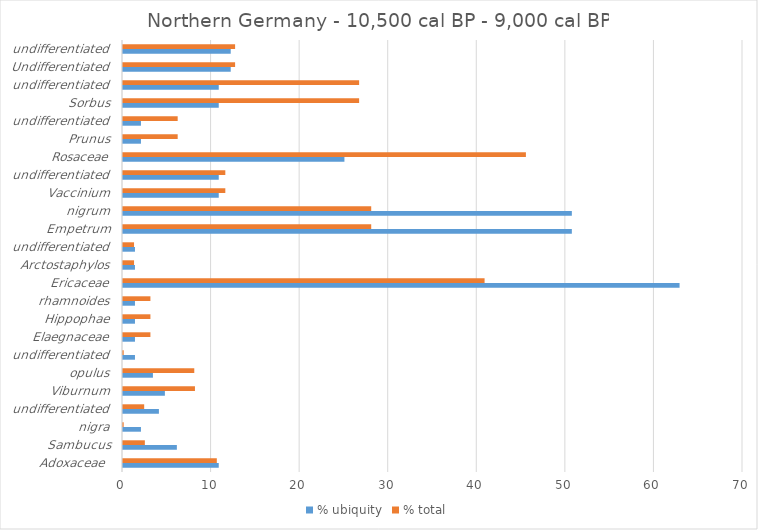
| Category | % ubiquity | % total |
|---|---|---|
| Adoxaceae  | 10.811 | 10.592 |
| Sambucus | 6.081 | 2.468 |
| nigra | 2.027 | 0.076 |
| undifferentiated | 4.054 | 2.392 |
| Viburnum | 4.73 | 8.125 |
| opulus | 3.378 | 8.047 |
| undifferentiated | 1.351 | 0.077 |
| Elaegnaceae | 1.351 | 3.095 |
| Hippophae | 1.351 | 3.095 |
| rhamnoides | 1.351 | 3.095 |
| Ericaceae | 62.838 | 40.824 |
| Arctostaphylos | 1.351 | 1.247 |
| undifferentiated | 1.351 | 1.247 |
| Empetrum | 50.676 | 28.025 |
| nigrum | 50.676 | 28.025 |
| Vaccinium | 10.811 | 11.552 |
| undifferentiated | 10.811 | 11.552 |
| Rosaceae | 25 | 45.489 |
| Prunus | 2.027 | 6.173 |
| undifferentiated | 2.027 | 6.173 |
| Sorbus | 10.811 | 26.659 |
| undifferentiated | 10.811 | 26.659 |
| Undifferentiated | 12.162 | 12.656 |
| undifferentiated | 12.162 | 12.656 |